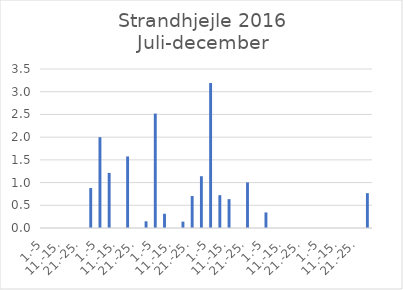
| Category | Series 0 |
|---|---|
| 1.-5 | 0 |
| 6.-10. | 0 |
| 11.-15. | 0 |
| 16.-20. | 0 |
| 21.-25. | 0 |
| 26.-31. | 0.88 |
| 1.-5 | 2 |
| 6.-10. | 1.213 |
| 11.-15. | 0 |
| 16.-20. | 1.575 |
| 21.-25. | 0 |
| 26.-31. | 0.147 |
| 1.-5 | 2.519 |
| 6.-10. | 0.314 |
| 11.-15. | 0 |
| 16.-20. | 0.14 |
| 21.-25. | 0.704 |
| 26.-30. | 1.14 |
| 1.-5 | 3.191 |
| 6.-10. | 0.723 |
| 11.-15. | 0.635 |
| 16.-20. | 0 |
| 21.-25. | 1.003 |
| 26.-31. | 0 |
| 1.-5 | 0.343 |
| 6.-10. | 0 |
| 11.-15. | 0 |
| 16.-20. | 0 |
| 21.-25. | 0 |
| 26.-30. | 0 |
| 1.-5 | 0 |
| 6.-10. | 0 |
| 11.-15. | 0 |
| 16.-20. | 0 |
| 21.-25. | 0 |
| 26.-31. | 0.767 |